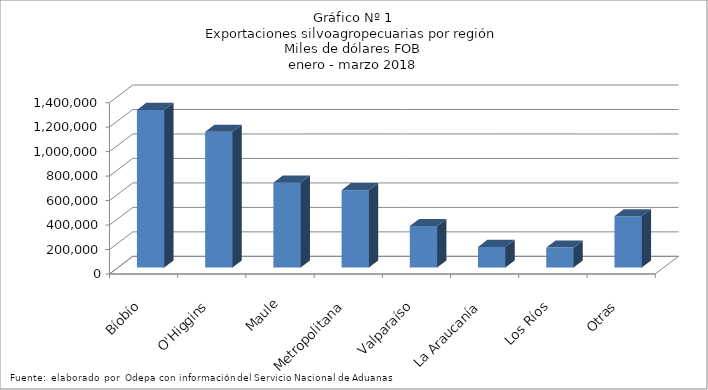
| Category | Series 0 |
|---|---|
| Bíobío | 1287673.96 |
| O'Higgins | 1109849.165 |
| Maule | 693646.421 |
| Metropolitana | 632414.754 |
| Valparaíso | 339005.247 |
| La Araucanía | 168704.947 |
| Los Ríos | 162855.765 |
| Otras | 418329.511 |